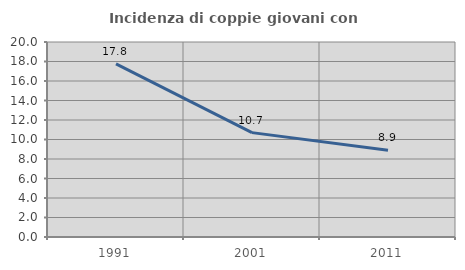
| Category | Incidenza di coppie giovani con figli |
|---|---|
| 1991.0 | 17.757 |
| 2001.0 | 10.705 |
| 2011.0 | 8.887 |